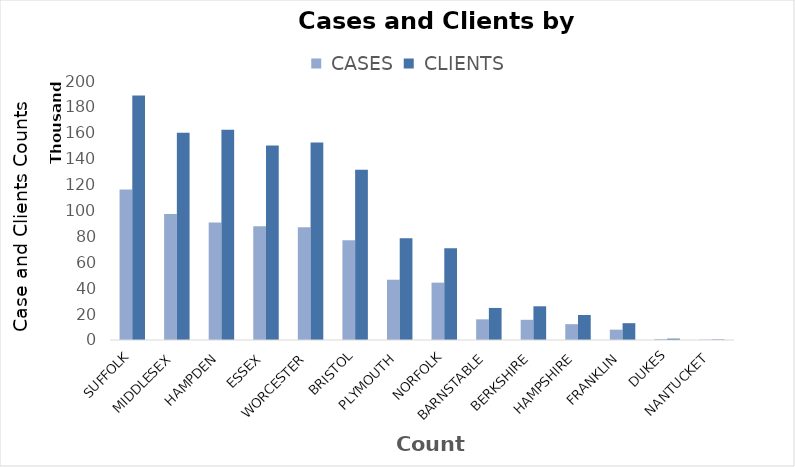
| Category |  CASES |  CLIENTS |
|---|---|---|
| SUFFOLK | 116196 | 188864 |
| MIDDLESEX | 97369 | 159975 |
| HAMPDEN | 90720 | 162410 |
| ESSEX | 87748 | 150161 |
| WORCESTER | 87051 | 152451 |
| BRISTOL | 76973 | 131392 |
| PLYMOUTH | 46535 | 78524 |
| NORFOLK | 44289 | 70943 |
| BARNSTABLE | 15950 | 24748 |
| BERKSHIRE | 15598 | 26030 |
| HAMPSHIRE | 12226 | 19291 |
| FRANKLIN | 7981 | 12985 |
| DUKES | 713 | 1051 |
| NANTUCKET | 232 | 402 |